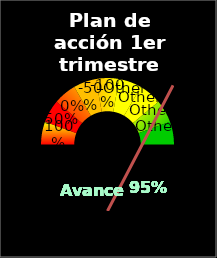
| Category | ESCALA |
|---|---|
| 0.1 | 1 |
| 0.2 | 1 |
| 0.3 | 1 |
| 0.4 | 1 |
| 0.5 | 1 |
| 0.6 | 1 |
| 0.7 | 1 |
| 0.8 | 1 |
| 0.9 | 1 |
| 1.0 | 9 |